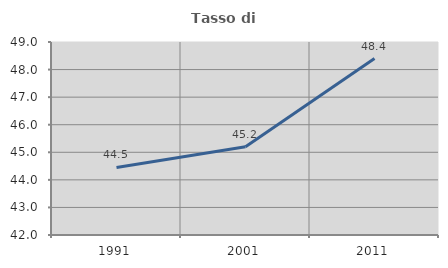
| Category | Tasso di occupazione   |
|---|---|
| 1991.0 | 44.451 |
| 2001.0 | 45.203 |
| 2011.0 | 48.4 |